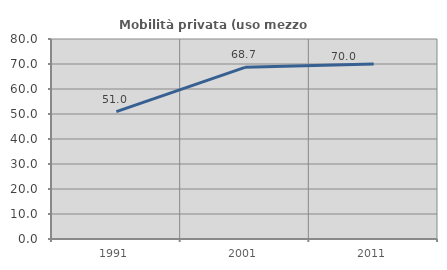
| Category | Mobilità privata (uso mezzo privato) |
|---|---|
| 1991.0 | 50.962 |
| 2001.0 | 68.681 |
| 2011.0 | 70.046 |